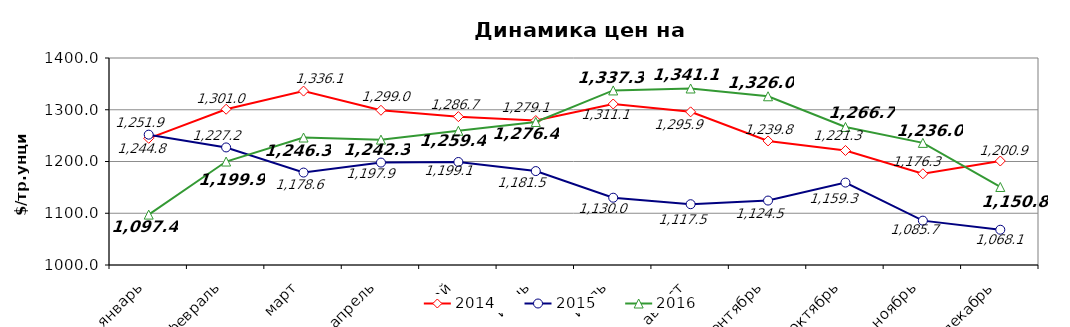
| Category | 2014 | 2015 | 2016 |
|---|---|---|---|
| январь | 1244.8 | 1251.85 | 1097.38 |
| февраль | 1300.98 | 1227.19 | 1199.91 |
| март | 1336.08 | 1178.63 | 1246.34 |
| апрель | 1299 | 1197.91 | 1242.26 |
| май | 1286.69 | 1199.05 | 1259.4 |
| июнь | 1279.1 | 1181.5 | 1276.4 |
| июль | 1311.11 | 1130.04 | 1337.33 |
| август | 1295.94 | 1117.48 | 1341.09 |
| сентябрь | 1239.75 | 1124.53 | 1326.03 |
| октябрь | 1221.27 | 1159.25 | 1266.71 |
| ноябрь | 1176.3 | 1085.7 | 1235.98 |
| декабрь | 1200.94 | 1068.14 | 1150.77 |